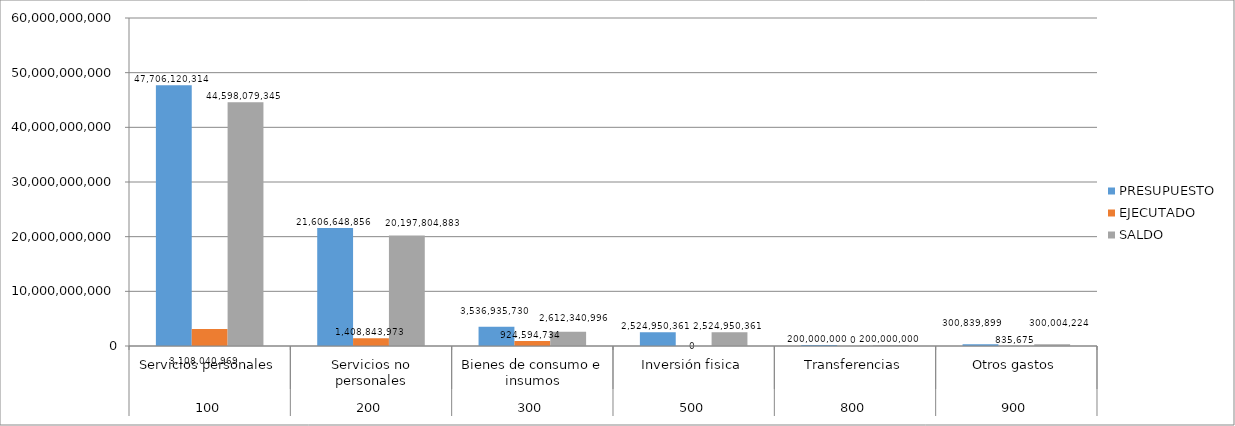
| Category | PRESUPUESTO | EJECUTADO | SALDO |
|---|---|---|---|
| 0 | 47706120314 | 3108040969 | 44598079345 |
| 1 | 21606648856 | 1408843973 | 20197804883 |
| 2 | 3536935730 | 924594734 | 2612340996 |
| 3 | 2524950361 | 0 | 2524950361 |
| 4 | 200000000 | 0 | 200000000 |
| 5 | 300839899 | 835675 | 300004224 |